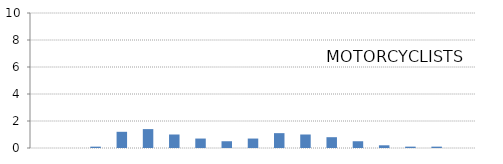
| Category | MOTORCYCLISTS |
|---|---|
| 0-4  | 0 |
| 5-9 | 0 |
| 10-14 | 0.1 |
| 15-19  | 1.2 |
| 20-24  | 1.4 |
| 25-29  | 1 |
| 30-34  | 0.7 |
| 35-39  | 0.5 |
| 40-44  | 0.7 |
| 45-49  | 1.1 |
| 50-54  | 1 |
| 55-59  | 0.8 |
| 60-64  | 0.5 |
| 65-69  | 0.2 |
| 70-74  | 0.1 |
| 75-79  | 0.1 |
| 80+ | 0 |